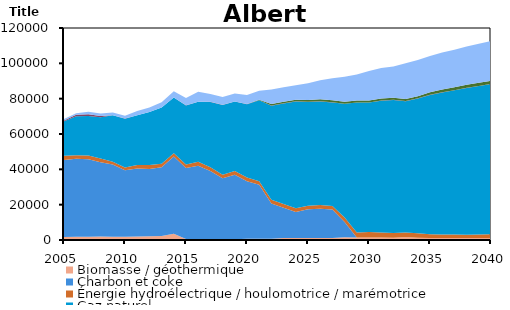
| Category | Biomasse / géothermique | Charbon et coke | Énergie hydroélectrique / houlomotrice / marémotrice | Gaz naturel | Pétrole | Solaire | Uranium | Éolien |
|---|---|---|---|---|---|---|---|---|
| 2005.0 | 1725.168 | 43581.072 | 2316 | 19568.76 | 509.437 | 0 | 0 | 741 |
| 2006.0 | 1855.169 | 44117.042 | 1966 | 22063.15 | 860.076 | 0 | 0 | 921 |
| 2007.0 | 1870.362 | 43868.232 | 2113 | 22337.97 | 922.065 | 0 | 0 | 1430 |
| 2008.0 | 1917.388 | 42131.103 | 2150 | 23347.1 | 635.87 | 0 | 0 | 1473 |
| 2009.0 | 1861.5 | 40804.999 | 1695 | 26233.32 | 14.148 | 0 | 0 | 1558 |
| 2010.0 | 1908.777 | 37566.913 | 1620 | 27594.87 | 26.51 | 0 | 0 | 1629 |
| 2011.0 | 1972.19 | 38509.516 | 2036 | 28106.9 | 25.399 | 0 | 0 | 2372 |
| 2012.0 | 2089.118 | 38070.062 | 2319 | 29938.05 | 28.934 | 0 | 0 | 2601 |
| 2013.0 | 2250.1 | 38933.515 | 2028 | 31739.48 | 26.996 | 0 | 0 | 3058 |
| 2014.0 | 3497.7 | 43727.183 | 1821.377 | 31585.45 | 78.409 | 0 | 0 | 3518.866 |
| 2015.0 | 578.191 | 40158.817 | 1977.46 | 33470.38 | 82.745 | 0 | 0 | 4089.32 |
| 2016.0 | 526.039 | 41488.27 | 2281.722 | 33892.11 | 52.462 | 0 | 0 | 5673.607 |
| 2017.0 | 412.404 | 38647.204 | 2061.788 | 37035.11 | 98.554 | 0 | 0 | 4416.643 |
| 2018.0 | 394.243 | 34493.014 | 2061.832 | 39521.06 | 89.957 | 26.28 | 0 | 4416.636 |
| 2019.0 | 394.246 | 36552.454 | 2061.689 | 39341.43 | 89.958 | 26.28 | 0 | 4416.652 |
| 2020.0 | 684.339 | 32576.974 | 2061.747 | 41554.15 | 89.958 | 26.28 | 0 | 5091.557 |
| 2021.0 | 719.379 | 30513.404 | 2061.761 | 45777.36 | 89.958 | 254.04 | 0 | 5091.554 |
| 2022.0 | 719.378 | 19939.614 | 2061.808 | 53283.17 | 89.957 | 954.839 | 0 | 8175.832 |
| 2023.0 | 1157.379 | 17148.904 | 2061.792 | 56887.77 | 90.402 | 954.84 | 0 | 8175.846 |
| 2024.0 | 1157.379 | 14720.414 | 2061.852 | 60459.37 | 89.958 | 954.84 | 0 | 8175.846 |
| 2025.0 | 1157.378 | 16213.904 | 2061.754 | 58663.8 | 89.958 | 1042.44 | 0 | 9451.927 |
| 2026.0 | 1174.898 | 16508.744 | 2061.762 | 58717.49 | 89.958 | 1068.72 | 0 | 10741.13 |
| 2027.0 | 1174.898 | 16039.144 | 2061.766 | 58598.64 | 89.958 | 1068.72 | 0 | 12560.7 |
| 2028.0 | 1612.898 | 8633.954 | 2508.724 | 64311 | 89.957 | 1068.719 | 0 | 14175.6 |
| 2029.0 | 1365.42 | 0 | 2933.575 | 73507.81 | 89.958 | 1068.72 | 0 | 14697.66 |
| 2030.0 | 1353.247 | 0 | 3113.923 | 73308.05 | 89.958 | 1156.321 | 0 | 16647.33 |
| 2031.0 | 1353.243 | 0 | 2826.185 | 74657.2 | 89.958 | 1156.319 | 0 | 17227.24 |
| 2032.0 | 1343.12 | 0 | 2601.224 | 75291.15 | 88.039 | 1157.377 | 0 | 17736.81 |
| 2033.0 | 1637.032 | 0 | 2585.199 | 74333.44 | 85.702 | 1151.694 | 0 | 20224.77 |
| 2034.0 | 1253.823 | 0 | 2557.418 | 76289.38 | 83.956 | 1250.856 | 0 | 20418.39 |
| 2035.0 | 1084.588 | 0 | 2197.08 | 78801.97 | 82.956 | 1462.155 | 0 | 20454.11 |
| 2036.0 | 1082.114 | 0 | 2029.037 | 80423.98 | 82.519 | 1599.099 | 0 | 20955.53 |
| 2037.0 | 1081.492 | 0 | 2027.174 | 81637.31 | 82.41 | 1701.298 | 0 | 21221.63 |
| 2038.0 | 1143.114 | 0 | 1866.366 | 83018.39 | 82.01 | 1716.996 | 0 | 21734.92 |
| 2039.0 | 1145.084 | 0 | 1980.507 | 84026.66 | 82.315 | 1757.968 | 0 | 22120.71 |
| 2040.0 | 1146.486 | 0 | 2190.536 | 84916.98 | 82.533 | 1797.519 | 0 | 22491.62 |